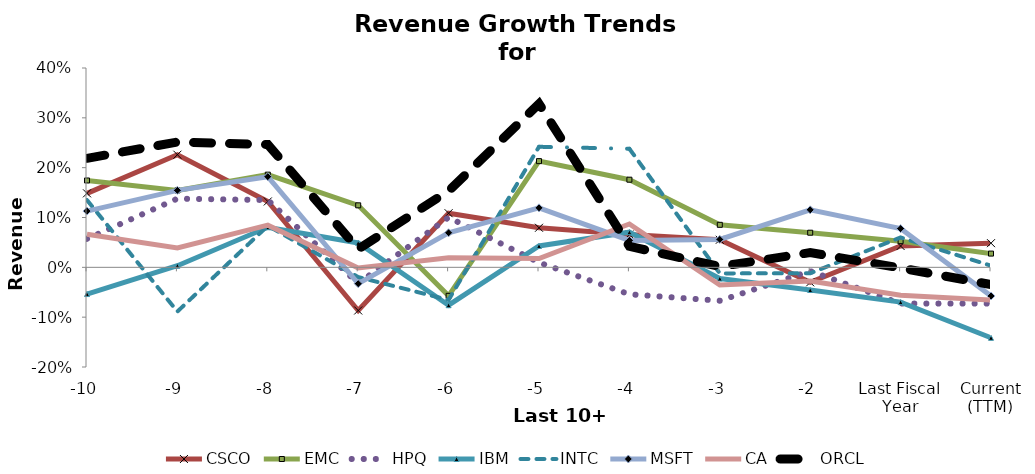
| Category | CSCO | EMC | HPQ | IBM | INTC | MSFT | CA | ORCL |
|---|---|---|---|---|---|---|---|---|
| -10 | 0.148 | 0.174 | 0.057 | -0.054 | 0.135 | 0.113 | 0.066 | 0.219 |
| -9 | 0.226 | 0.154 | 0.138 | 0.003 | -0.089 | 0.154 | 0.039 | 0.252 |
| -8 | 0.132 | 0.186 | 0.135 | 0.08 | 0.083 | 0.182 | 0.085 | 0.246 |
| -7 | -0.087 | 0.124 | -0.032 | 0.049 | -0.02 | -0.033 | -0.001 | 0.037 |
| -6 | 0.109 | -0.057 | 0.1 | -0.076 | -0.065 | 0.069 | 0.019 | 0.153 |
| -5 | 0.079 | 0.213 | 0.01 | 0.043 | 0.242 | 0.119 | 0.018 | 0.328 |
| -4 | 0.066 | 0.176 | -0.054 | 0.07 | 0.238 | 0.054 | 0.087 | 0.042 |
| -3 | 0.055 | 0.085 | -0.067 | -0.022 | -0.012 | 0.056 | -0.036 | 0.002 |
| -2 | -0.03 | 0.07 | -0.008 | -0.046 | -0.012 | 0.115 | -0.028 | 0.03 |
| Last Fiscal Year | 0.043 | 0.052 | -0.073 | -0.07 | 0.06 | 0.078 | -0.056 | -0.001 |
| Current (TTM) | 0.048 | 0.028 | -0.073 | -0.141 | 0.003 | -0.058 | -0.066 | -0.035 |